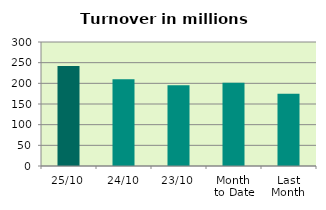
| Category | Series 0 |
|---|---|
| 25/10 | 241.757 |
| 24/10 | 209.788 |
| 23/10 | 195.122 |
| Month 
to Date | 201.68 |
| Last
Month | 174.723 |